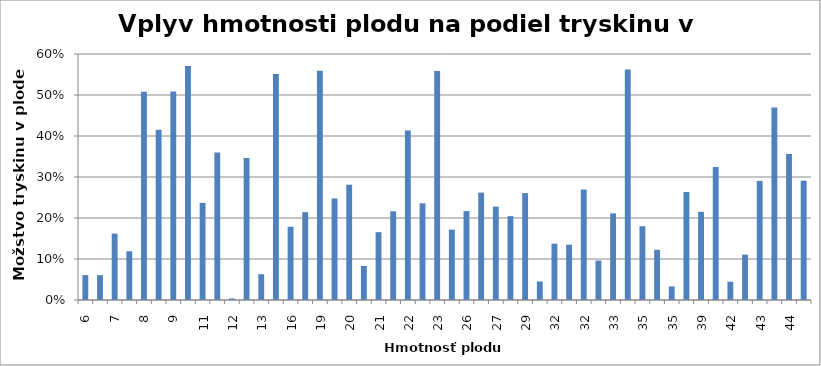
| Category | Series 0 |
|---|---|
| 6.43 | 0.061 |
| 6.43 | 0.061 |
| 6.71 | 0.162 |
| 7.5 | 0.119 |
| 8.25 | 0.508 |
| 8.64 | 0.415 |
| 9.09 | 0.509 |
| 10.57 | 0.571 |
| 11.17 | 0.237 |
| 11.51 | 0.36 |
| 11.97 | 0.004 |
| 12.83 | 0.347 |
| 13.46 | 0.063 |
| 14.01 | 0.551 |
| 15.88 | 0.179 |
| 17.09 | 0.214 |
| 18.71 | 0.559 |
| 19.12 | 0.248 |
| 20.09 | 0.281 |
| 20.18 | 0.083 |
| 21.11 | 0.165 |
| 21.4 | 0.216 |
| 21.85 | 0.414 |
| 23.13 | 0.236 |
| 23.48 | 0.559 |
| 25.53 | 0.172 |
| 25.6 | 0.217 |
| 25.924 | 0.262 |
| 26.76 | 0.228 |
| 27.01 | 0.205 |
| 29.05 | 0.261 |
| 30.63 | 0.045 |
| 31.5 | 0.137 |
| 32.02 | 0.135 |
| 32.39 | 0.27 |
| 32.76 | 0.096 |
| 33.44 | 0.211 |
| 33.69 | 0.562 |
| 34.76 | 0.18 |
| 34.87 | 0.123 |
| 34.97 | 0.033 |
| 38.83 | 0.263 |
| 39.22 | 0.215 |
| 40.02 | 0.325 |
| 42.32 | 0.045 |
| 42.78 | 0.111 |
| 42.94 | 0.29 |
| 43.05 | 0.469 |
| 44.12 | 0.356 |
| 46.27 | 0.291 |